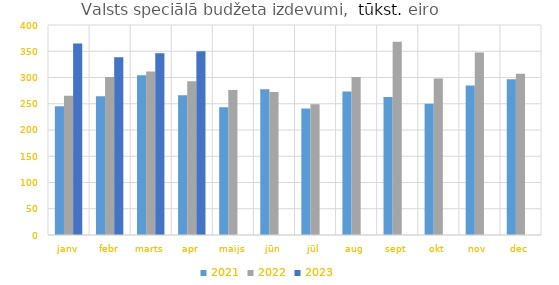
| Category | 2021 | 2022 | 2023 |
|---|---|---|---|
| janv | 245021.603 | 265366.62 | 364905.213 |
| febr | 264114.802 | 301122.134 | 338753.3 |
| marts | 304192.595 | 311449.105 | 346087.76 |
| apr | 266305.843 | 292908.695 | 349816.348 |
| maijs | 243231.118 | 276006.043 | 0 |
| jūn | 277705.46 | 272418.808 | 0 |
| jūl | 241038.074 | 248833.143 | 0 |
| aug | 273534.561 | 300867.01 | 0 |
| sept | 262890.697 | 368202.062 | 0 |
| okt | 249947.821 | 298051.418 | 0 |
| nov | 284917.624 | 347493.693 | 0 |
| dec | 296686.983 | 306911.749 | 0 |